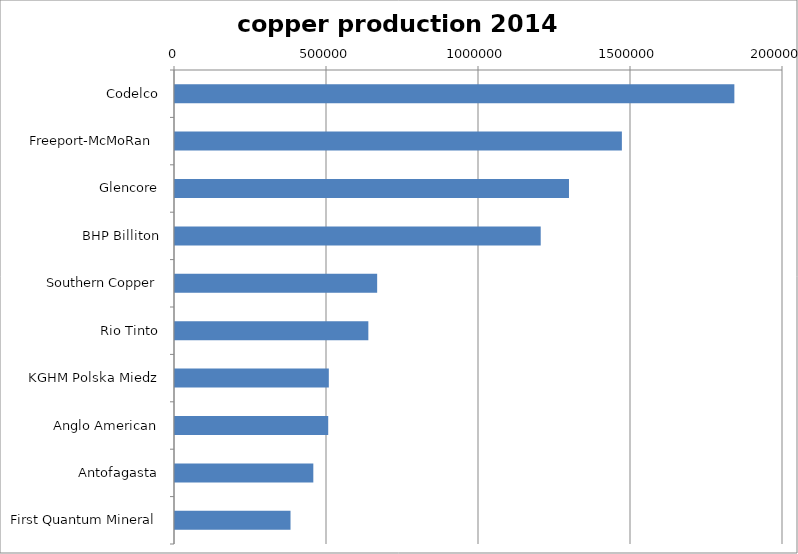
| Category | production 2014 |
|---|---|
| Codelco | 1840000 |
| Freeport-McMoRan  | 1470000 |
| Glencore | 1296000 |
| BHP Billiton | 1203000 |
| Southern Copper | 665000 |
| Rio Tinto | 636000 |
| KGHM Polska Miedz | 506000 |
| Anglo American | 504000 |
| Antofagasta | 455000 |
| First Quantum Mineral | 380000 |